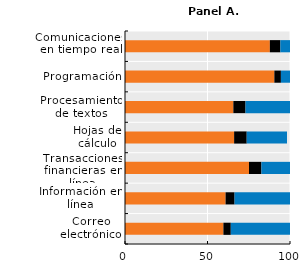
| Category | Nunca  | Menos de una vez por semana | Al menos una vez por semana |
|---|---|---|---|
| Correo electrónico | 59.64 | 4.481 | 35.879 |
| Información en línea | 60.959 | 5.442 | 33.599 |
| Transacciones financieras en línea | 75.149 | 7.518 | 17.333 |
| Hojas de cálculo | 66.135 | 7.633 | 24.414 |
| Procesamiento de textos | 65.669 | 7.376 | 26.955 |
| Programación | 90.517 | 3.972 | 5.511 |
| Comunicaciones en tiempo real | 87.793 | 6.364 | 5.844 |